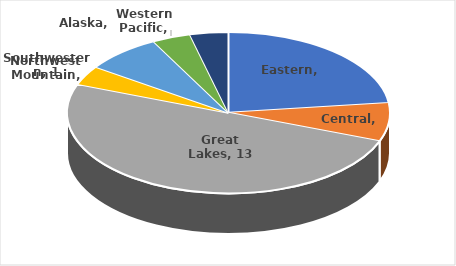
| Category | Series 0 |
|---|---|
| Eastern | 6 |
| Central | 2 |
| Great Lakes | 13 |
| Southwestern | 1 |
| Northwest Mountain | 2 |
| Western Pacific | 1 |
| Alaska | 1 |